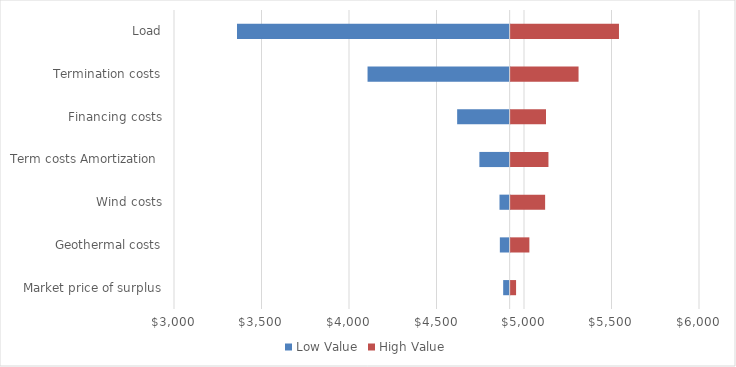
| Category | Low Value | High Value |
|---|---|---|
| Market price of surplus | 4881 | 4949 |
| Geothermal costs | 4862 | 5025 |
| Wind costs | 4860 | 5115 |
| Term costs Amortization  | 4745 | 5134 |
| Financing costs | 4618 | 5120 |
| Termination costs | 4106 | 5306 |
| Load | 3360 | 5537 |